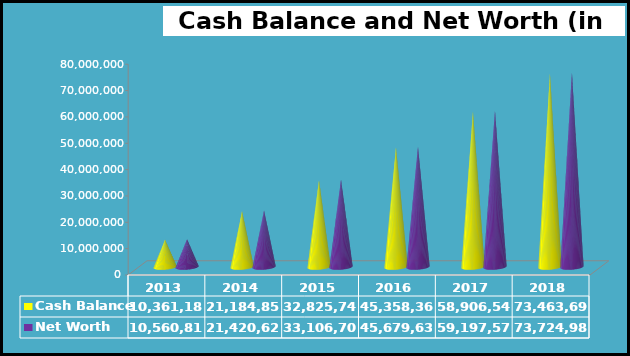
| Category | Cash Balance | Net Worth |
|---|---|---|
| 2013.0 | 10361181.993 | 10560811.37 |
| 2014.0 | 21184856.946 | 21420625.554 |
| 2015.0 | 32825745.058 | 33106707.215 |
| 2016.0 | 45358366.411 | 45679635.018 |
| 2017.0 | 58906540.283 | 59197571.761 |
| 2018.0 | 73463697.244 | 73724985.957 |